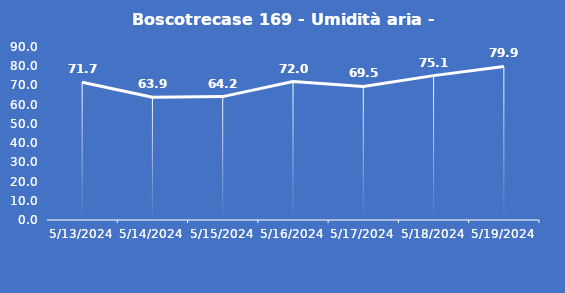
| Category | Boscotrecase 169 - Umidità aria - Grezzo (%) |
|---|---|
| 5/13/24 | 71.7 |
| 5/14/24 | 63.9 |
| 5/15/24 | 64.2 |
| 5/16/24 | 72 |
| 5/17/24 | 69.5 |
| 5/18/24 | 75.1 |
| 5/19/24 | 79.9 |